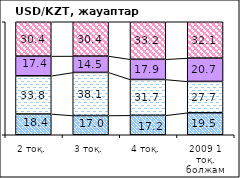
| Category | жоғарылайды | өзгермейді | төмендейді | #ССЫЛКА! |
|---|---|---|---|---|
| 2 тоқ. | 18.38 | 33.8 | 17.42 | 30.4 |
| 3 тоқ. | 17.02 | 38.14 | 14.47 | 30.37 |
| 4 тоқ.  | 17.21 | 31.71 | 17.87 | 33.21 |
| 2009 1 тоқ. болжам | 19.48 | 27.7 | 20.68 | 32.13 |